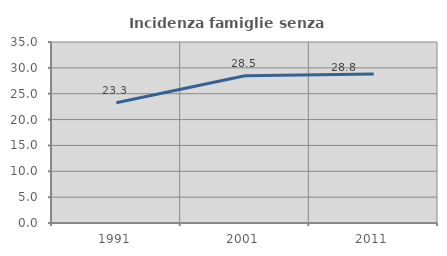
| Category | Incidenza famiglie senza nuclei |
|---|---|
| 1991.0 | 23.264 |
| 2001.0 | 28.477 |
| 2011.0 | 28.797 |